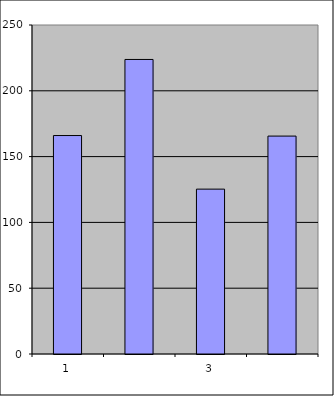
| Category | Series 0 |
|---|---|
| 0 | 166 |
| 1 | 223.81 |
| 2 | 125.277 |
| 3 | 165.588 |